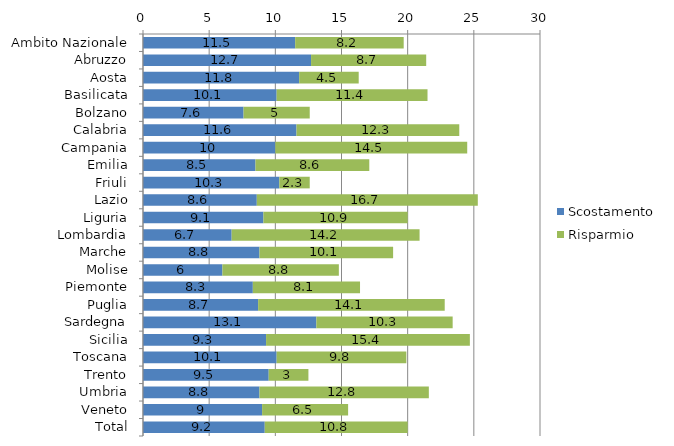
| Category | Scostamento | Risparmio |
|---|---|---|
| Ambito Nazionale | 11.5 | 8.2 |
| Abruzzo | 12.7 | 8.7 |
| Aosta | 11.8 | 4.5 |
| Basilicata | 10.1 | 11.4 |
| Bolzano | 7.6 | 5 |
| Calabria | 11.6 | 12.3 |
| Campania | 10 | 14.5 |
| Emilia | 8.5 | 8.6 |
| Friuli | 10.3 | 2.3 |
| Lazio | 8.6 | 16.7 |
| Liguria | 9.1 | 10.9 |
| Lombardia | 6.7 | 14.2 |
| Marche | 8.8 | 10.1 |
| Molise | 6 | 8.8 |
| Piemonte | 8.3 | 8.1 |
| Puglia | 8.7 | 14.1 |
| Sardegna | 13.1 | 10.3 |
| Sicilia | 9.3 | 15.4 |
| Toscana | 10.1 | 9.8 |
| Trento | 9.5 | 3 |
| Umbria | 8.8 | 12.8 |
| Veneto | 9 | 6.5 |
| Total | 9.2 | 10.8 |